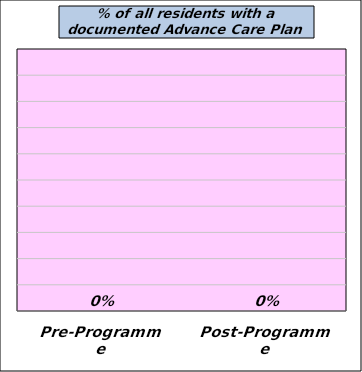
| Category | Had |
|---|---|
| Pre-Programme | 0 |
| Post-Programme | 0 |